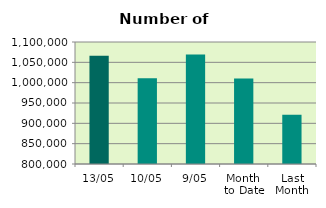
| Category | Series 0 |
|---|---|
| 13/05 | 1066286 |
| 10/05 | 1010646 |
| 9/05 | 1069280 |
| Month 
to Date | 1010511.75 |
| Last
Month | 921109.3 |